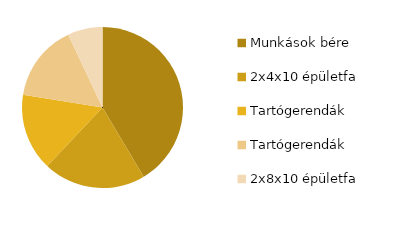
| Category | Series 0 |
|---|---|
| Munkások bére | 200 |
| 2x4x10 épületfa | 99.4 |
| Tartógerendák | 74.7 |
| Tartógerendák | 74.7 |
| 2x8x10 épületfa | 33.75 |